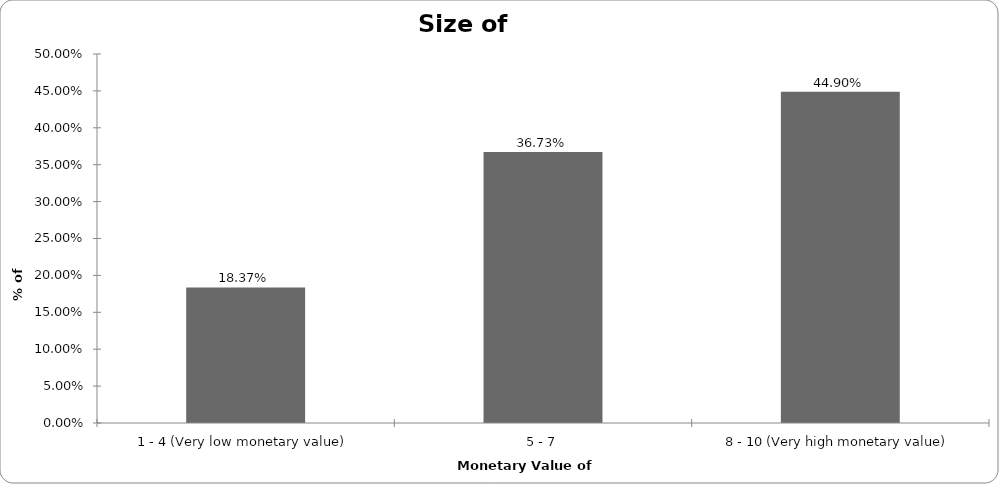
| Category | % of SME Respondents |
|---|---|
| 1 - 4 (Very low monetary value) | 0.184 |
| 5 - 7 | 0.367 |
| 8 - 10 (Very high monetary value) | 0.449 |